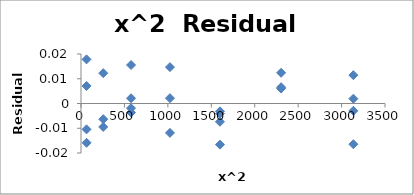
| Category | Series 0 |
|---|---|
| 64.0 | 0.018 |
| 64.0 | 0.007 |
| 64.0 | -0.01 |
| 64.0 | -0.016 |
| 256.0 | -0.006 |
| 256.0 | -0.009 |
| 256.0 | 0.012 |
| 576.0 | -0.004 |
| 576.0 | -0.002 |
| 576.0 | 0.002 |
| 576.0 | 0.016 |
| 1024.0 | -0.012 |
| 1024.0 | 0.002 |
| 1024.0 | 0.015 |
| 1600.0 | -0.007 |
| 1600.0 | -0.003 |
| 1600.0 | -0.017 |
| 1600.0 | -0.004 |
| 2304.0 | 0.006 |
| 2304.0 | 0.007 |
| 2304.0 | 0.012 |
| 3136.0 | 0.002 |
| 3136.0 | -0.003 |
| 3136.0 | 0.011 |
| 3136.0 | -0.016 |